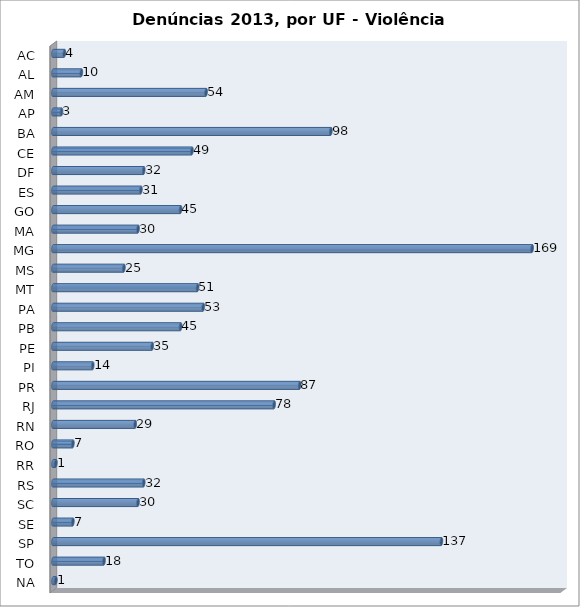
| Category | Series 0 |
|---|---|
| AC | 4 |
| AL | 10 |
| AM | 54 |
| AP | 3 |
| BA | 98 |
| CE | 49 |
| DF | 32 |
| ES | 31 |
| GO | 45 |
| MA | 30 |
| MG | 169 |
| MS | 25 |
| MT | 51 |
| PA | 53 |
| PB | 45 |
| PE | 35 |
| PI | 14 |
| PR | 87 |
| RJ | 78 |
| RN | 29 |
| RO | 7 |
| RR | 1 |
| RS | 32 |
| SC | 30 |
| SE | 7 |
| SP | 137 |
| TO | 18 |
| NA | 1 |